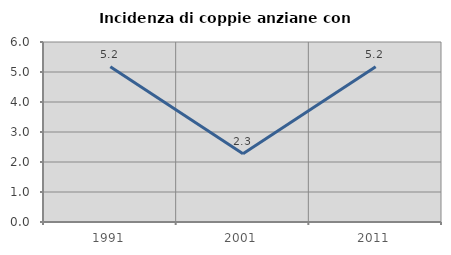
| Category | Incidenza di coppie anziane con figli |
|---|---|
| 1991.0 | 5.172 |
| 2001.0 | 2.277 |
| 2011.0 | 5.176 |